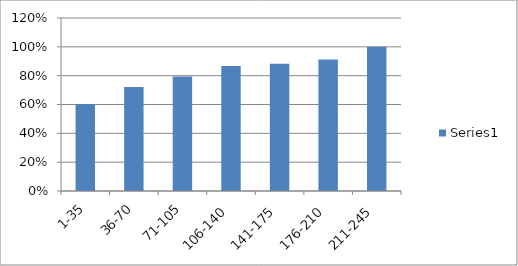
| Category | Series 0 |
|---|---|
| 1-35 | 0.603 |
| 36-70 | 0.721 |
| 71-105 | 0.794 |
| 106-140 | 0.868 |
| 141-175 | 0.882 |
| 176-210 | 0.912 |
| 211-245 | 1 |